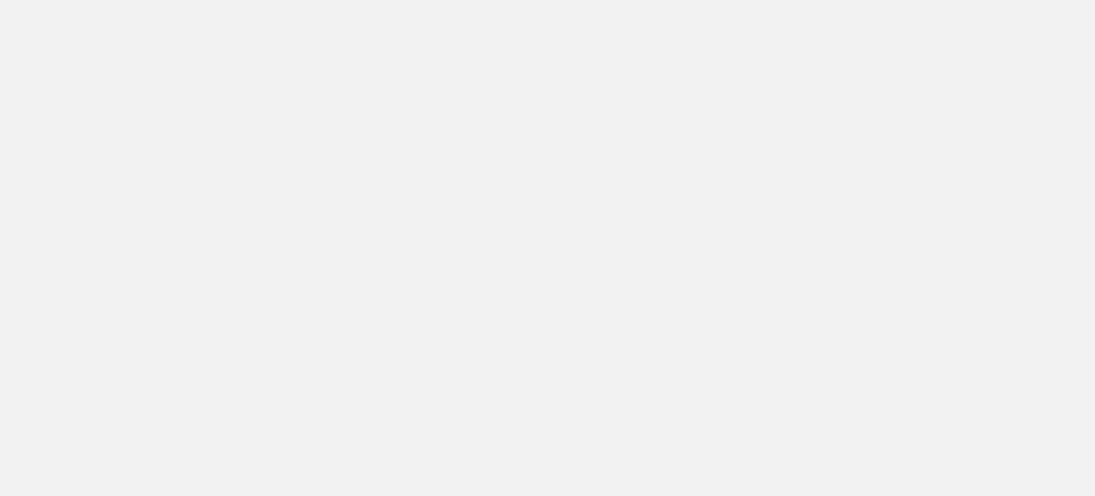
| Category | Total |
|---|---|
| Al Hodeidah | 75335 |
| Hajjah | 72706 |
| Marib | 51411 |
| Al Jawf | 14809 |
| Taiz | 14534 |
| Hadramawt | 8306 |
| Sadah | 7417 |
| Aden | 5191 |
| Lahj | 4950 |
| Amran | 4830 |
| Abyan | 4181 |
| Sanaa | 3933 |
| Ad Dali | 3592 |
| Ibb | 2964 |
| Dhamar | 2232 |
| Al Bayda | 1763 |
| Shabwah | 1118 |
| Al Mahwit | 762 |
| Al Maharah | 457 |
| Raymah | 451 |
| Sanaa City | 167 |
| Socotra | 15 |